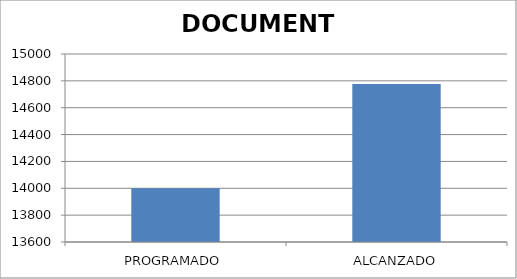
| Category | DOCUMENTO |
|---|---|
| PROGRAMADO | 14000 |
| ALCANZADO | 14777 |